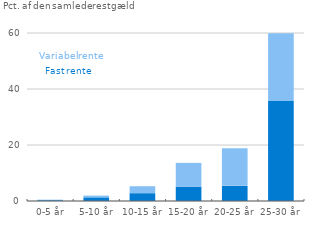
| Category | Restgæld med fast rente | Restgæld med variabel rente |
|---|---|---|
| 0-5 år | 0.291 | 0.185 |
| 5-10 år | 1.303 | 0.619 |
| 10-15 år | 2.794 | 2.477 |
| 15-20 år | 5.15 | 8.466 |
| 20-25 år | 5.415 | 13.394 |
| 25-30 år | 35.677 | 24.23 |